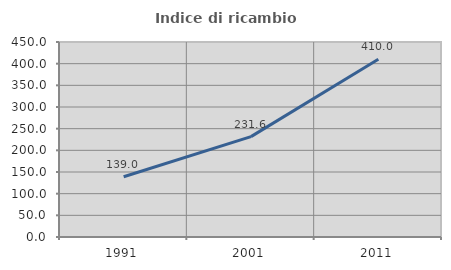
| Category | Indice di ricambio occupazionale  |
|---|---|
| 1991.0 | 138.973 |
| 2001.0 | 231.648 |
| 2011.0 | 410.02 |